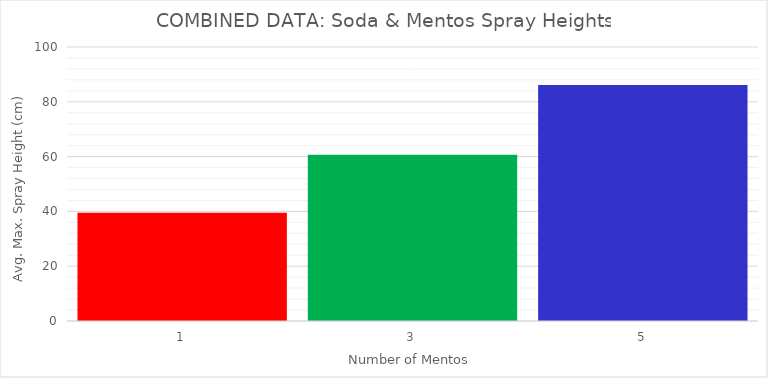
| Category | Series 0 |
|---|---|
| 1.0 | 39.5 |
| 3.0 | 60.7 |
| 5.0 | 86.1 |